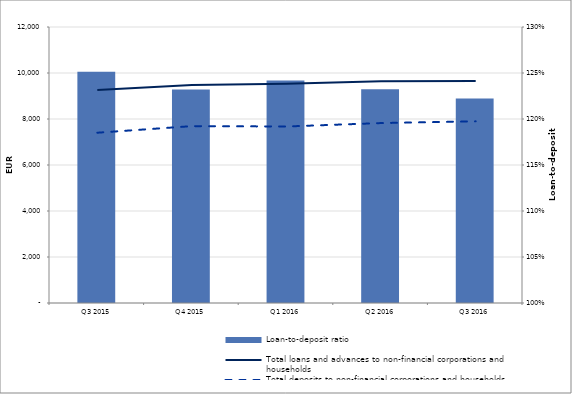
| Category | Loan-to-deposit ratio |
|---|---|
| Q3 2015 | 1.251 |
| Q4 2015 | 1.232 |
| Q1 2016 | 1.242 |
| Q2 2016 | 1.232 |
| Q3 2016 | 1.222 |